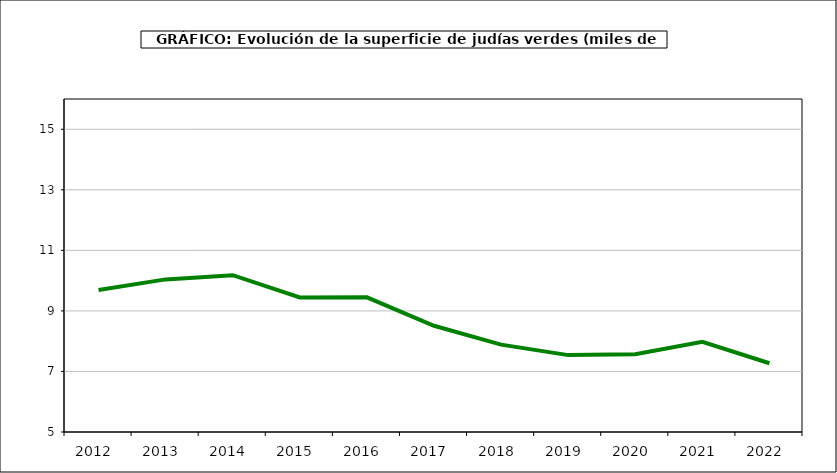
| Category | superficie |
|---|---|
| 2012.0 | 9.694 |
| 2013.0 | 10.041 |
| 2014.0 | 10.18 |
| 2015.0 | 9.445 |
| 2016.0 | 9.45 |
| 2017.0 | 8.509 |
| 2018.0 | 7.885 |
| 2019.0 | 7.54 |
| 2020.0 | 7.571 |
| 2021.0 | 7.98 |
| 2022.0 | 7.272 |